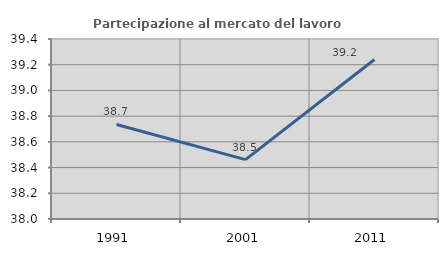
| Category | Partecipazione al mercato del lavoro  femminile |
|---|---|
| 1991.0 | 38.735 |
| 2001.0 | 38.462 |
| 2011.0 | 39.241 |